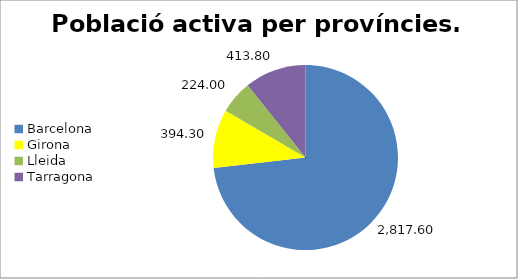
| Category | Trimestre 2 |
|---|---|
| Barcelona | 2817.6 |
| Girona | 394.3 |
| Lleida | 224 |
| Tarragona | 413.8 |